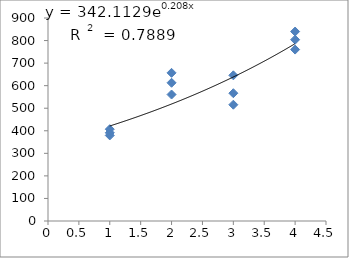
| Category | Series 0 |
|---|---|
| 1.0 | 379.284 |
| 1.0 | 391.137 |
| 1.0 | 406.94 |
| 2.0 | 612.828 |
| 2.0 | 560.758 |
| 2.0 | 656.887 |
| 3.0 | 645.875 |
| 3.0 | 566.557 |
| 3.0 | 515.567 |
| 4.0 | 839.908 |
| 4.0 | 760.039 |
| 4.0 | 803.838 |